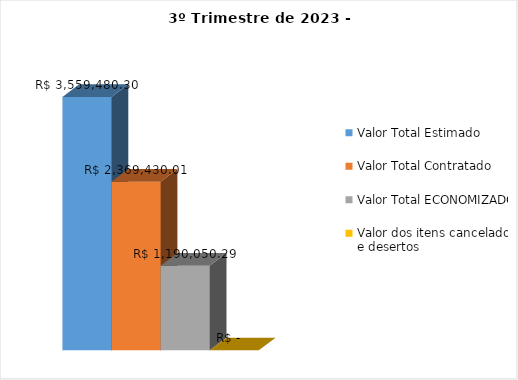
| Category | Valor Total Estimado | Valor Total Contratado | Valor Total ECONOMIZADO | Valor dos itens cancelados e desertos |
|---|---|---|---|---|
| 0 | 3559480.3 | 2369430.01 | 1190050.29 | 0 |